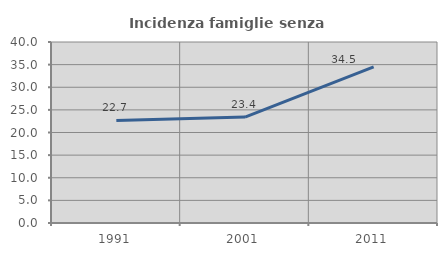
| Category | Incidenza famiglie senza nuclei |
|---|---|
| 1991.0 | 22.654 |
| 2001.0 | 23.411 |
| 2011.0 | 34.516 |